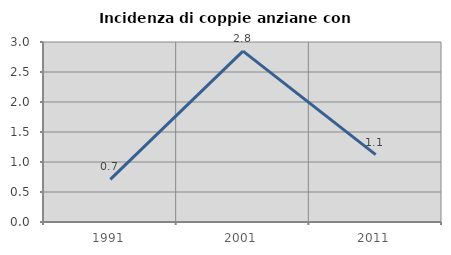
| Category | Incidenza di coppie anziane con figli |
|---|---|
| 1991.0 | 0.709 |
| 2001.0 | 2.848 |
| 2011.0 | 1.124 |